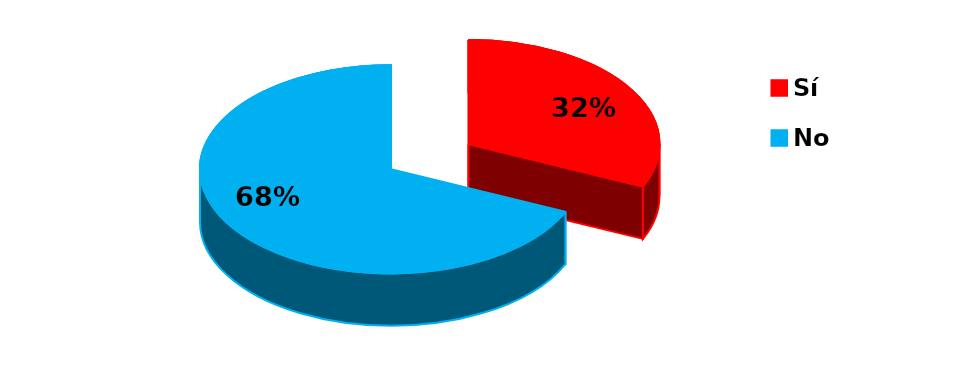
| Category | Series 0 |
|---|---|
| 0 | 19 |
| 1 | 41 |